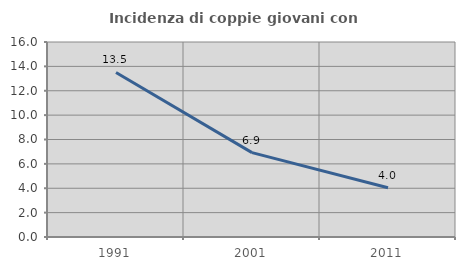
| Category | Incidenza di coppie giovani con figli |
|---|---|
| 1991.0 | 13.498 |
| 2001.0 | 6.925 |
| 2011.0 | 4.045 |